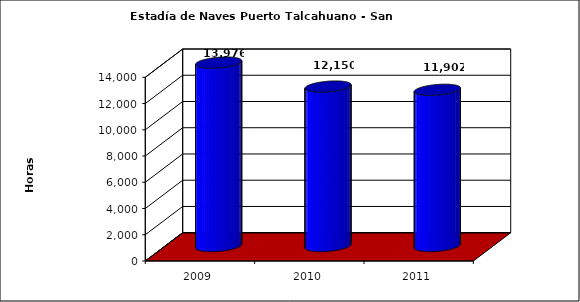
| Category | Series 0 |
|---|---|
| 2009.0 | 13976 |
| 2010.0 | 12150 |
| 2011.0 | 11902 |